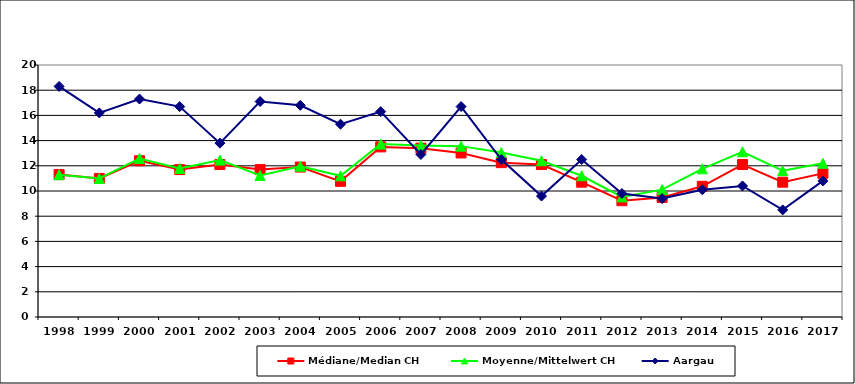
| Category | Médiane/Median CH | Moyenne/Mittelwert CH | Aargau |
|---|---|---|---|
| 1998.0 | 11.3 | 11.291 | 18.3 |
| 1999.0 | 11 | 10.991 | 16.2 |
| 2000.0 | 12.4 | 12.575 | 17.3 |
| 2001.0 | 11.7 | 11.788 | 16.7 |
| 2002.0 | 12.1 | 12.452 | 13.8 |
| 2003.0 | 11.7 | 11.236 | 17.1 |
| 2004.0 | 11.9 | 11.971 | 16.8 |
| 2005.0 | 10.768 | 11.206 | 15.3 |
| 2006.0 | 13.5 | 13.724 | 16.3 |
| 2007.0 | 13.4 | 13.616 | 12.9 |
| 2008.0 | 13.02 | 13.561 | 16.7 |
| 2009.0 | 12.25 | 13.048 | 12.5 |
| 2010.0 | 12.1 | 12.4 | 9.6 |
| 2011.0 | 10.7 | 11.209 | 12.5 |
| 2012.0 | 9.23 | 9.534 | 9.8 |
| 2013.0 | 9.49 | 10.106 | 9.4 |
| 2014.0 | 10.37 | 11.762 | 10.1 |
| 2015.0 | 12.1 | 13.11 | 10.4 |
| 2016.0 | 10.7 | 11.618 | 8.5 |
| 2017.0 | 11.4 | 12.196 | 10.8 |